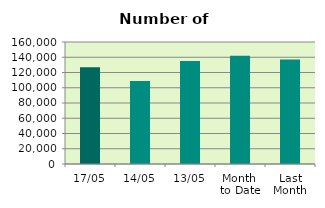
| Category | Series 0 |
|---|---|
| 17/05 | 126958 |
| 14/05 | 108826 |
| 13/05 | 134922 |
| Month 
to Date | 141848.182 |
| Last
Month | 137031.8 |